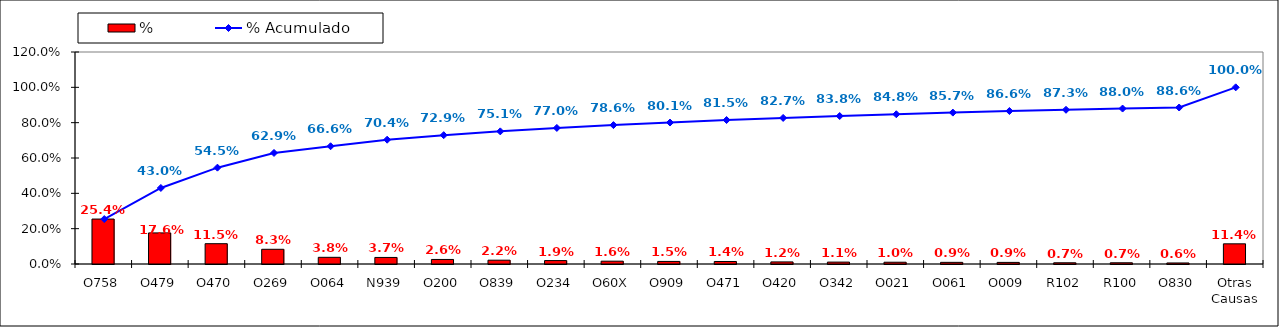
| Category | % |
|---|---|
| O758 | 0.254 |
| O479 | 0.176 |
| O470 | 0.115 |
| O269 | 0.083 |
| O064 | 0.038 |
| N939 | 0.037 |
| O200 | 0.026 |
| O839 | 0.022 |
| O234 | 0.019 |
| O60X | 0.016 |
| O909 | 0.015 |
| O471 | 0.014 |
| O420 | 0.012 |
| O342 | 0.011 |
| O021 | 0.01 |
| O061 | 0.009 |
| O009 | 0.009 |
| R102 | 0.007 |
| R100 | 0.007 |
| O830 | 0.006 |
| Otras Causas | 0.114 |